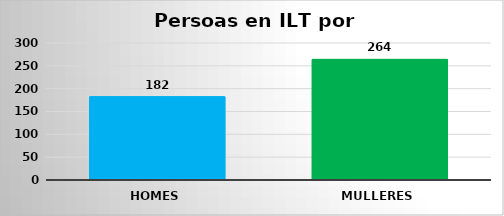
| Category | Series 6 |
|---|---|
| Homes | 182 |
| Mulleres | 264 |